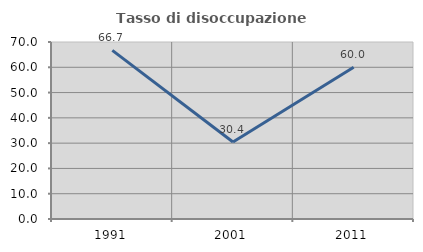
| Category | Tasso di disoccupazione giovanile  |
|---|---|
| 1991.0 | 66.667 |
| 2001.0 | 30.435 |
| 2011.0 | 60 |